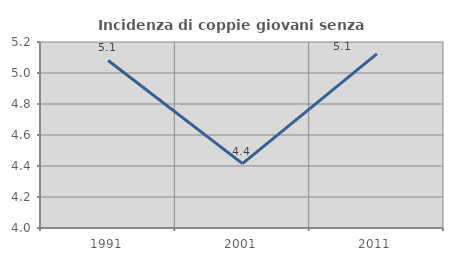
| Category | Incidenza di coppie giovani senza figli |
|---|---|
| 1991.0 | 5.081 |
| 2001.0 | 4.415 |
| 2011.0 | 5.123 |